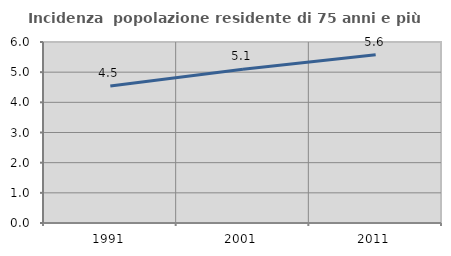
| Category | Incidenza  popolazione residente di 75 anni e più |
|---|---|
| 1991.0 | 4.539 |
| 2001.0 | 5.094 |
| 2011.0 | 5.581 |